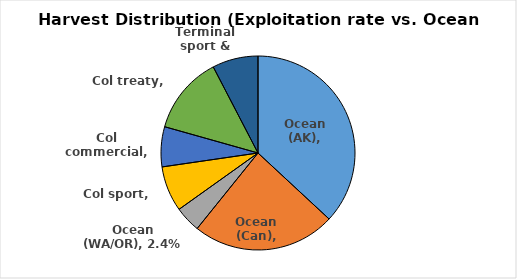
| Category | Series 0 |
|---|---|
| Ocean (AK) | 0.204 |
| Ocean (Can) | 0.132 |
| Ocean (WA/OR) | 0.024 |
| Col sport | 0.042 |
| Col commercial | 0.037 |
| Col treaty | 0.072 |
| Terminal sport & treaty | 0.042 |